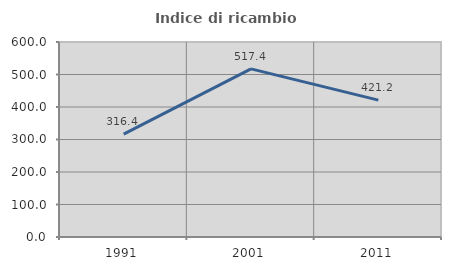
| Category | Indice di ricambio occupazionale  |
|---|---|
| 1991.0 | 316.364 |
| 2001.0 | 517.391 |
| 2011.0 | 421.212 |